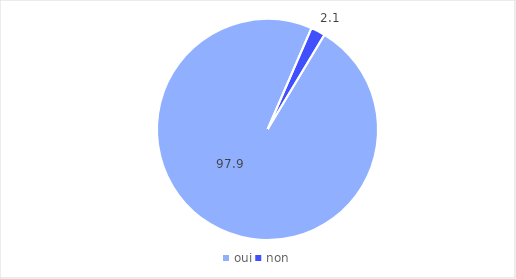
| Category | Series 0 |
|---|---|
| oui | 97.9 |
| non | 2.1 |